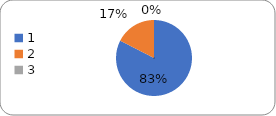
| Category | Series 0 |
|---|---|
| 0 | 104 |
| 1 | 22 |
| 2 | 0 |